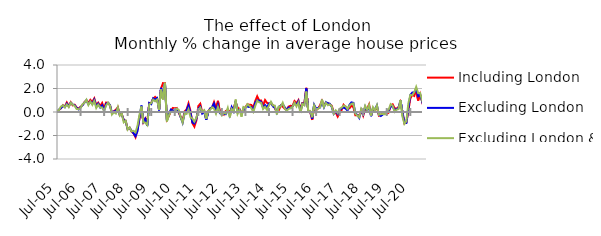
| Category | Including London | Excluding London | Excluding London & SE |
|---|---|---|---|
| 2005-07-01 | 0.014 | -0.006 | 0.09 |
| 2005-08-01 | 0.163 | 0.204 | 0.162 |
| 2005-09-01 | 0.324 | 0.325 | 0.462 |
| 2005-10-01 | 0.577 | 0.533 | 0.574 |
| 2005-11-01 | 0.466 | 0.417 | 0.391 |
| 2005-12-01 | 0.812 | 0.711 | 0.637 |
| 2006-01-01 | 0.5 | 0.49 | 0.413 |
| 2006-02-01 | 0.828 | 0.794 | 0.795 |
| 2006-03-01 | 0.563 | 0.637 | 0.633 |
| 2006-04-01 | 0.621 | 0.57 | 0.521 |
| 2006-05-01 | 0.386 | 0.352 | 0.256 |
| 2006-06-01 | 0.291 | 0.226 | 0.232 |
| 2006-07-01 | 0.438 | 0.412 | 0.342 |
| 2006-08-01 | 0.591 | 0.577 | 0.661 |
| 2006-09-01 | 0.848 | 0.81 | 0.786 |
| 2006-10-01 | 0.979 | 1.005 | 1.049 |
| 2006-11-01 | 0.775 | 0.651 | 0.593 |
| 2006-12-01 | 1.037 | 0.905 | 0.892 |
| 2007-01-01 | 0.858 | 0.697 | 0.609 |
| 2007-02-01 | 1.157 | 1.043 | 0.936 |
| 2007-03-01 | 0.591 | 0.493 | 0.34 |
| 2007-04-01 | 0.791 | 0.71 | 0.625 |
| 2007-05-01 | 0.495 | 0.385 | 0.394 |
| 2007-06-01 | 0.773 | 0.572 | 0.376 |
| 2007-07-01 | 0.314 | 0.122 | 0.088 |
| 2007-08-01 | 0.802 | 0.688 | 0.543 |
| 2007-09-01 | 0.779 | 0.781 | 0.791 |
| 2007-10-01 | 0.566 | 0.59 | 0.551 |
| 2007-11-01 | -0.121 | -0.088 | -0.213 |
| 2007-12-01 | 0.07 | 0.05 | -0.02 |
| 2008-01-01 | 0.193 | 0.09 | -0.129 |
| 2008-02-01 | 0.407 | 0.326 | 0.403 |
| 2008-03-01 | -0.27 | -0.262 | -0.309 |
| 2008-04-01 | -0.198 | -0.21 | -0.151 |
| 2008-05-01 | -0.666 | -0.685 | -0.88 |
| 2008-06-01 | -0.763 | -0.783 | -0.746 |
| 2008-07-01 | -1.456 | -1.471 | -1.501 |
| 2008-08-01 | -1.333 | -1.353 | -1.313 |
| 2008-09-01 | -1.666 | -1.602 | -1.648 |
| 2008-10-01 | -1.827 | -1.811 | -1.607 |
| 2008-11-01 | -2.152 | -2.056 | -1.731 |
| 2008-12-01 | -1.511 | -1.621 | -1.176 |
| 2009-01-01 | -0.593 | -0.517 | -0.245 |
| 2009-02-01 | 0.356 | 0.548 | 0.469 |
| 2009-03-01 | -0.862 | -0.838 | -0.892 |
| 2009-04-01 | -0.536 | -0.573 | -0.91 |
| 2009-05-01 | -0.786 | -1.169 | -1.113 |
| 2009-06-01 | 0.762 | 0.765 | 0.654 |
| 2009-07-01 | 0.77 | 0.668 | 0.757 |
| 2009-08-01 | 1.139 | 1.168 | 1.057 |
| 2009-09-01 | 1.284 | 1.066 | 0.915 |
| 2009-10-01 | 1.145 | 1.185 | 1.057 |
| 2009-11-01 | 0.204 | 0.132 | 0.175 |
| 2009-12-01 | 1.994 | 2.051 | 1.926 |
| 2010-01-01 | 2.456 | 1.338 | 1.065 |
| 2010-02-01 | 2.445 | 2.446 | 2.482 |
| 2010-03-01 | -0.631 | -0.699 | -0.798 |
| 2010-04-01 | -0.337 | -0.232 | -0.267 |
| 2010-05-01 | 0.08 | 0.209 | 0.025 |
| 2010-06-01 | 0.344 | 0.125 | 0.033 |
| 2010-07-01 | 0.307 | 0.142 | -0.011 |
| 2010-08-01 | 0.345 | 0.255 | 0.288 |
| 2010-09-01 | -0.055 | 0.062 | 0.191 |
| 2010-10-01 | -0.41 | -0.446 | -0.406 |
| 2010-11-01 | -0.762 | -0.901 | -0.892 |
| 2010-12-01 | 0.039 | -0.111 | -0.135 |
| 2011-01-01 | 0.213 | 0.123 | -0.163 |
| 2011-02-01 | 0.73 | 0.546 | 0.225 |
| 2011-03-01 | 0.086 | -0.077 | -0.432 |
| 2011-04-01 | -0.954 | -0.902 | -0.557 |
| 2011-05-01 | -1.249 | -0.981 | -0.818 |
| 2011-06-01 | -0.74 | -0.596 | -0.5 |
| 2011-07-01 | 0.505 | 0.275 | 0.127 |
| 2011-08-01 | 0.701 | 0.46 | 0.372 |
| 2011-09-01 | -0.047 | -0.129 | 0.006 |
| 2011-10-01 | 0.117 | 0.014 | 0.143 |
| 2011-11-01 | -0.617 | -0.667 | -0.587 |
| 2011-12-01 | 0.055 | -0.052 | 0.093 |
| 2012-01-01 | 0.295 | 0.294 | 0.186 |
| 2012-02-01 | 0.36 | 0.421 | 0.403 |
| 2012-03-01 | 0.843 | 0.717 | 0.273 |
| 2012-04-01 | 0.364 | 0.061 | -0.139 |
| 2012-05-01 | 0.952 | 0.595 | 0.425 |
| 2012-06-01 | -0.019 | -0.101 | -0.026 |
| 2012-07-01 | -0.072 | -0.142 | -0.294 |
| 2012-08-01 | -0.223 | -0.16 | -0.074 |
| 2012-09-01 | 0.09 | -0.186 | -0.136 |
| 2012-10-01 | 0.146 | 0.175 | 0.348 |
| 2012-11-01 | 0.01 | -0.282 | -0.45 |
| 2012-12-01 | 0.315 | 0.413 | 0.258 |
| 2013-01-01 | 0.332 | 0.067 | 0.042 |
| 2013-02-01 | 0.833 | 0.921 | 1.056 |
| 2013-03-01 | 0.377 | 0.077 | -0.149 |
| 2013-04-01 | 0.245 | 0.201 | 0.193 |
| 2013-05-01 | -0.058 | -0.181 | -0.399 |
| 2013-06-01 | 0.126 | 0.163 | 0.425 |
| 2013-07-01 | 0.41 | 0.376 | 0.327 |
| 2013-08-01 | 0.651 | 0.477 | 0.669 |
| 2013-09-01 | 0.62 | 0.419 | 0.535 |
| 2013-10-01 | 0.603 | 0.427 | 0.325 |
| 2013-11-01 | 0.38 | 0.14 | 0.019 |
| 2013-12-01 | 0.926 | 0.799 | 0.519 |
| 2014-01-01 | 1.335 | 0.991 | 0.948 |
| 2014-02-01 | 0.981 | 0.961 | 0.831 |
| 2014-03-01 | 0.985 | 0.866 | 0.783 |
| 2014-04-01 | 0.53 | 0.356 | 0.254 |
| 2014-05-01 | 1.019 | 0.588 | 0.447 |
| 2014-06-01 | 0.776 | 0.387 | 0.18 |
| 2014-07-01 | 0.717 | 0.724 | 0.564 |
| 2014-08-01 | 0.727 | 0.804 | 0.871 |
| 2014-09-01 | 0.572 | 0.476 | 0.556 |
| 2014-10-01 | 0.318 | 0.392 | 0.54 |
| 2014-11-01 | -0.016 | -0.05 | -0.201 |
| 2014-12-01 | 0.147 | 0.409 | 0.465 |
| 2015-01-01 | 0.541 | 0.556 | 0.472 |
| 2015-02-01 | 0.463 | 0.664 | 0.785 |
| 2015-03-01 | 0.276 | 0.404 | 0.313 |
| 2015-04-01 | 0.215 | 0.135 | 0.1 |
| 2015-05-01 | 0.462 | 0.387 | 0.265 |
| 2015-06-01 | 0.531 | 0.335 | 0.319 |
| 2015-07-01 | 0.504 | 0.475 | 0.439 |
| 2015-08-01 | 0.926 | 0.728 | 0.785 |
| 2015-09-01 | 0.744 | 0.63 | 0.47 |
| 2015-10-01 | 1.002 | 0.909 | 0.805 |
| 2015-11-01 | 0.18 | 0.057 | -0.084 |
| 2015-12-01 | 0.758 | 0.715 | 0.683 |
| 2016-01-01 | 0.731 | 0.64 | 0.563 |
| 2016-02-01 | 2.056 | 2.01 | 1.737 |
| 2016-03-01 | 0.095 | 0.048 | 0.044 |
| 2016-04-01 | 0.025 | 0.04 | 0.087 |
| 2016-05-01 | -0.678 | -0.567 | -0.446 |
| 2016-06-01 | 0.4 | 0.62 | 0.557 |
| 2016-07-01 | 0.156 | 0.297 | 0.17 |
| 2016-08-01 | 0.292 | 0.338 | 0.284 |
| 2016-09-01 | 0.57 | 0.376 | 0.394 |
| 2016-10-01 | 0.961 | 0.873 | 1.054 |
| 2016-11-01 | 0.568 | 0.405 | 0.425 |
| 2016-12-01 | 0.772 | 0.839 | 0.778 |
| 2017-01-01 | 0.752 | 0.746 | 0.58 |
| 2017-02-01 | 0.644 | 0.699 | 0.656 |
| 2017-03-01 | 0.524 | 0.42 | 0.472 |
| 2017-04-01 | -0.028 | -0.157 | -0.133 |
| 2017-05-01 | -0.034 | 0.05 | 0.137 |
| 2017-06-01 | -0.389 | -0.161 | -0.085 |
| 2017-07-01 | -0.047 | 0.204 | 0.271 |
| 2017-08-01 | 0.16 | 0.299 | 0.374 |
| 2017-09-01 | 0.615 | 0.383 | 0.545 |
| 2017-10-01 | 0.436 | 0.291 | 0.494 |
| 2017-11-01 | 0.329 | 0.132 | 0.255 |
| 2017-12-01 | 0.311 | 0.61 | 0.54 |
| 2018-01-01 | 0.543 | 0.82 | 0.699 |
| 2018-02-01 | 0.408 | 0.774 | 0.734 |
| 2018-03-01 | -0.275 | -0.1 | -0.134 |
| 2018-04-01 | -0.266 | -0.251 | -0.3 |
| 2018-05-01 | -0.302 | -0.503 | -0.45 |
| 2018-06-01 | 0.152 | 0.164 | 0.257 |
| 2018-07-01 | -0.316 | -0.198 | -0.056 |
| 2018-08-01 | 0.283 | 0.446 | 0.522 |
| 2018-09-01 | 0.257 | 0.111 | 0.166 |
| 2018-10-01 | 0.643 | 0.475 | 0.59 |
| 2018-11-01 | -0.297 | -0.358 | -0.315 |
| 2018-12-01 | 0.233 | 0.299 | 0.403 |
| 2019-01-01 | 0.149 | 0.237 | 0.126 |
| 2019-02-01 | 0.449 | 0.559 | 0.569 |
| 2019-03-01 | -0.311 | -0.241 | -0.234 |
| 2019-04-01 | -0.253 | -0.341 | -0.185 |
| 2019-05-01 | -0.005 | -0.213 | -0.168 |
| 2019-06-01 | -0.066 | -0.078 | -0.192 |
| 2019-07-01 | -0.17 | 0.04 | 0.075 |
| 2019-08-01 | -0.053 | 0.132 | 0.219 |
| 2019-09-01 | 0.55 | 0.453 | 0.664 |
| 2019-10-01 | 0.654 | 0.501 | 0.527 |
| 2019-11-01 | 0.326 | 0.135 | 0.017 |
| 2019-12-01 | 0.286 | 0.251 | 0.191 |
| 2020-01-01 | 0.415 | 0.337 | 0.247 |
| 2020-02-01 | 0.842 | 1.001 | 1.02 |
| 2020-03-01 | 0.038 | -0.015 | -0.388 |
| 2020-04-01 | -0.97 | -0.9 | -1.008 |
| 2020-05-01 | -0.902 | -0.932 | -0.779 |
| 2020-06-01 | 0.085 | 0.27 | 0.716 |
| 2020-07-01 | 1.141 | 1.439 | 1.448 |
| 2020-08-01 | 1.463 | 1.651 | 1.418 |
| 2020-09-01 | 1.365 | 1.673 | 1.688 |
| 2020-10-01 | 1.859 | 1.943 | 2.14 |
| 2020-11-01 | 0.98 | 1.343 | 1.609 |
| 2020-12-01 | 1.511 | 1.489 | 1.621 |
| 2021-01-01 | 0.879 | 0.904 | 1.006 |
| 2021-02-01 | 1.3 | 1.195 | 1.295 |
| 2021-03-01 | 0.682 | 0.718 | 0.777 |